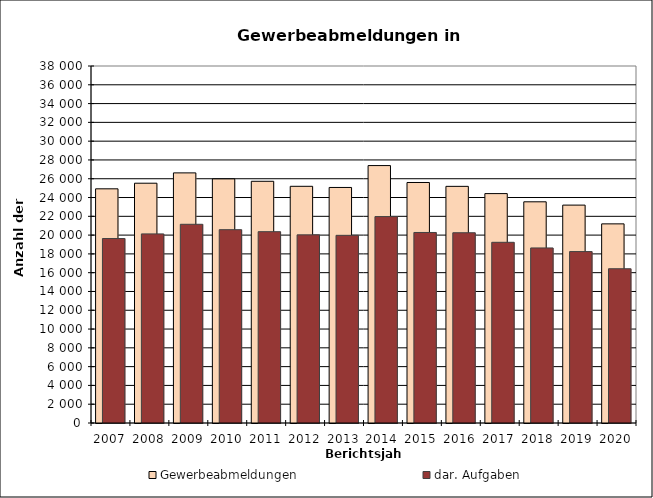
| Category | Gewerbeabmeldungen | dar. Aufgaben |
|---|---|---|
| 2007.0 | 24926 | 19635 |
| 2008.0 | 25523 | 20128 |
| 2009.0 | 26623 | 21151 |
| 2010.0 | 25984 | 20578 |
| 2011.0 | 25729 | 20364 |
| 2012.0 | 25195 | 20027 |
| 2013.0 | 25071 | 19975 |
| 2014.0 | 27402 | 21971 |
| 2015.0 | 25601 | 20280 |
| 2016.0 | 25189 | 20252 |
| 2017.0 | 24417 | 19234 |
| 2018.0 | 23545 | 18633 |
| 2019.0 | 23193 | 18245 |
| 2020.0 | 21196 | 16419 |